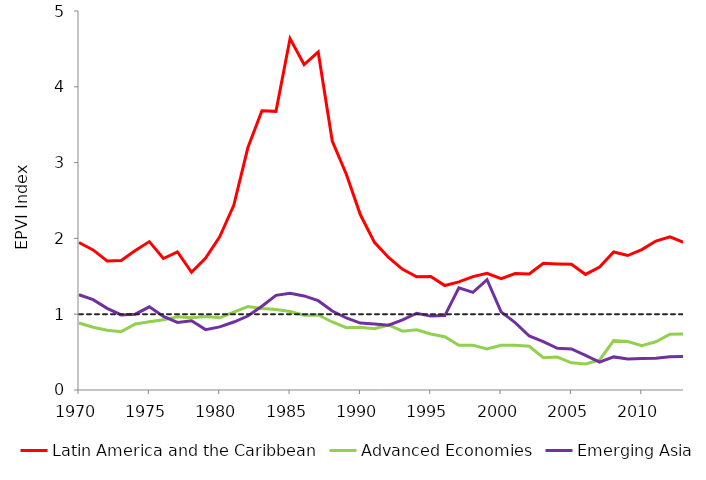
| Category | Latin America and the Caribbean | Advanced Economies | Emerging Asia | One |
|---|---|---|---|---|
| 1970.0 | 1.946 | 0.884 | 1.256 | 1 |
| 1971.0 | 1.848 | 0.829 | 1.191 | 1 |
| 1972.0 | 1.702 | 0.788 | 1.077 | 1 |
| 1973.0 | 1.709 | 0.77 | 0.99 | 1 |
| 1974.0 | 1.84 | 0.871 | 1 | 1 |
| 1975.0 | 1.958 | 0.901 | 1.097 | 1 |
| 1976.0 | 1.734 | 0.926 | 0.97 | 1 |
| 1977.0 | 1.821 | 0.967 | 0.891 | 1 |
| 1978.0 | 1.554 | 0.953 | 0.912 | 1 |
| 1979.0 | 1.741 | 0.969 | 0.797 | 1 |
| 1980.0 | 2.021 | 0.952 | 0.832 | 1 |
| 1981.0 | 2.436 | 1.028 | 0.897 | 1 |
| 1982.0 | 3.196 | 1.101 | 0.976 | 1 |
| 1983.0 | 3.684 | 1.076 | 1.106 | 1 |
| 1984.0 | 3.676 | 1.062 | 1.249 | 1 |
| 1985.0 | 4.636 | 1.035 | 1.276 | 1 |
| 1986.0 | 4.294 | 0.987 | 1.241 | 1 |
| 1987.0 | 4.46 | 0.99 | 1.178 | 1 |
| 1988.0 | 3.284 | 0.897 | 1.042 | 1 |
| 1989.0 | 2.846 | 0.822 | 0.95 | 1 |
| 1990.0 | 2.311 | 0.828 | 0.883 | 1 |
| 1991.0 | 1.948 | 0.809 | 0.871 | 1 |
| 1992.0 | 1.749 | 0.858 | 0.855 | 1 |
| 1993.0 | 1.593 | 0.775 | 0.926 | 1 |
| 1994.0 | 1.493 | 0.794 | 1.013 | 1 |
| 1995.0 | 1.497 | 0.74 | 0.975 | 1 |
| 1996.0 | 1.378 | 0.703 | 0.982 | 1 |
| 1997.0 | 1.426 | 0.59 | 1.348 | 1 |
| 1998.0 | 1.495 | 0.589 | 1.287 | 1 |
| 1999.0 | 1.539 | 0.542 | 1.455 | 1 |
| 2000.0 | 1.468 | 0.59 | 1.031 | 1 |
| 2001.0 | 1.536 | 0.591 | 0.89 | 1 |
| 2002.0 | 1.53 | 0.576 | 0.712 | 1 |
| 2003.0 | 1.671 | 0.426 | 0.639 | 1 |
| 2004.0 | 1.663 | 0.434 | 0.55 | 1 |
| 2005.0 | 1.659 | 0.359 | 0.542 | 1 |
| 2006.0 | 1.525 | 0.342 | 0.456 | 1 |
| 2007.0 | 1.623 | 0.398 | 0.368 | 1 |
| 2008.0 | 1.82 | 0.652 | 0.437 | 1 |
| 2009.0 | 1.774 | 0.64 | 0.41 | 1 |
| 2010.0 | 1.853 | 0.586 | 0.416 | 1 |
| 2011.0 | 1.965 | 0.637 | 0.419 | 1 |
| 2012.0 | 2.022 | 0.735 | 0.438 | 1 |
| 2013.0 | 1.946 | 0.739 | 0.443 | 1 |